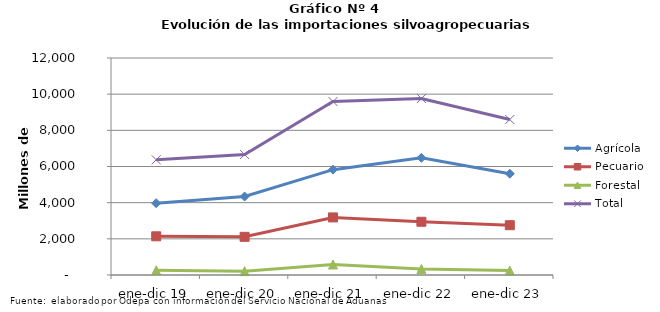
| Category | Agrícola | Pecuario | Forestal | Total |
|---|---|---|---|---|
| ene-dic 19 | 3969656 | 2140199 | 260080 | 6369935 |
| ene-dic 20 | 4338913 | 2110613 | 213634 | 6663160 |
| ene-dic 21 | 5825992 | 3184434 | 580660 | 9591086 |
| ene-dic 22 | 6480032 | 2944530 | 335036 | 9759598 |
| ene-dic 23 | 5599035 | 2754504 | 244456 | 8597995 |